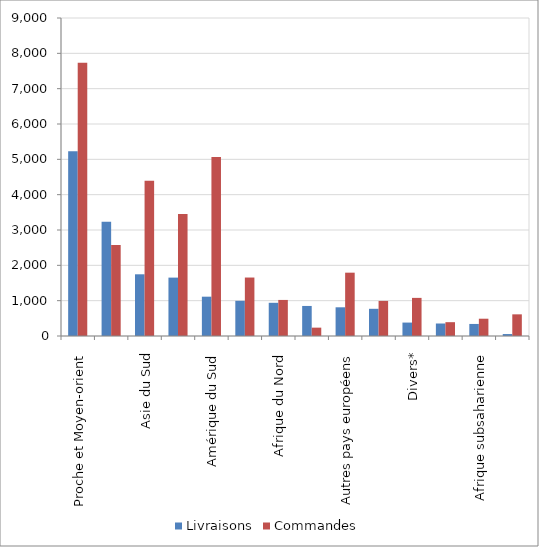
| Category | Livraisons | Commandes |
|---|---|---|
| Proche et Moyen-orient | 5230.2 | 7737 |
| Union européenne | 3234.8 | 2576.7 |
| Asie du Sud | 1746.4 | 4391.7 |
| Asie du Sud-Est | 1652.6 | 3450.8 |
| Amérique du Sud | 1112.8 | 5064.1 |
| Amérique du Nord | 996 | 1654.8 |
| Afrique du Nord | 939.7 | 1020.7 |
| Océanie | 850.3 | 236.5 |
| Autres pays européens | 812.4 | 1792.2 |
| Asie du Nord-Est | 769.7 | 993 |
| Divers* | 380.1 | 1078.8 |
| Amérique centrale et Caraïbes | 353.7 | 391.3 |
| Afrique subsaharienne | 341.1 | 489.2 |
| Asie centrale | 55.3 | 612.9 |